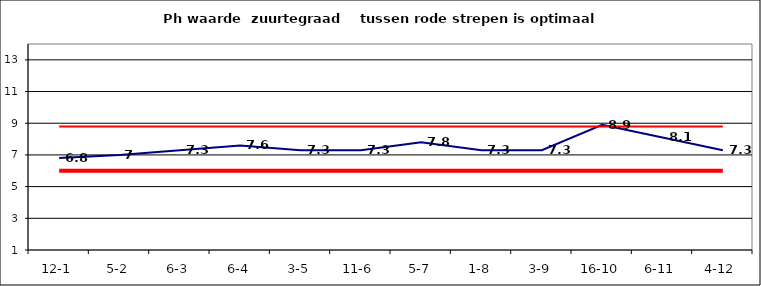
| Category | Series 0 | Series 1 | Series 2 |
|---|---|---|---|
| 12-1 | 6.8 | 6 | 8.8 |
| 5-2 | 7 | 6 | 8.8 |
| 6-3 | 7.3 | 6 | 8.8 |
| 6-4 | 7.6 | 6 | 8.8 |
| 3-5 | 7.3 | 6 | 8.8 |
| 11-6 | 7.3 | 6 | 8.8 |
| 5-7 | 7.8 | 6 | 8.8 |
| 1-8 | 7.3 | 6 | 8.8 |
| 3-9 | 7.3 | 6 | 8.8 |
| 16-10 | 8.9 | 6 | 8.8 |
| 6-11 | 8.1 | 6 | 8.8 |
| 4-12 | 7.3 | 6 | 8.8 |